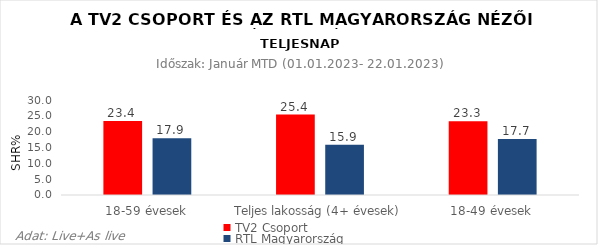
| Category | TV2 Csoport | RTL Magyarország |
|---|---|---|
| 18-59 évesek | 23.4 | 17.9 |
| Teljes lakosság (4+ évesek) | 25.4 | 15.9 |
| 18-49 évesek | 23.3 | 17.7 |